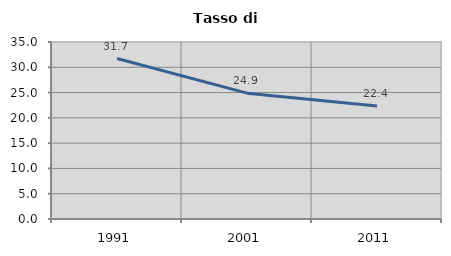
| Category | Tasso di disoccupazione   |
|---|---|
| 1991.0 | 31.736 |
| 2001.0 | 24.889 |
| 2011.0 | 22.358 |